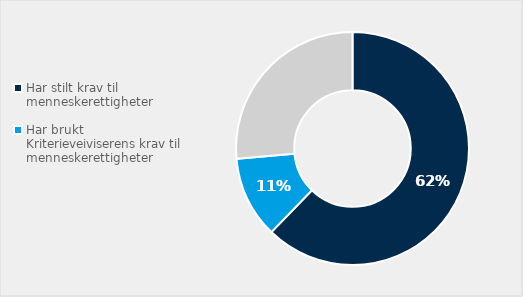
| Category | Total andel |
|---|---|
| Har stilt krav til menneskerettigheter | 0.623 |
| Har brukt Kriterieveiviserens krav til menneskerettigheter | 0.113 |
| Nei  | 0.264 |